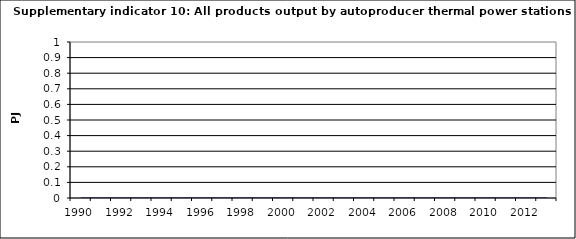
| Category | All products output by autoproducer thermal power stations, PJ |
|---|---|
| 1990 | 0 |
| 1991 | 0 |
| 1992 | 0 |
| 1993 | 0 |
| 1994 | 0 |
| 1995 | 0 |
| 1996 | 0 |
| 1997 | 0 |
| 1998 | 0 |
| 1999 | 0 |
| 2000 | 0 |
| 2001 | 0 |
| 2002 | 0 |
| 2003 | 0 |
| 2004 | 0 |
| 2005 | 0 |
| 2006 | 0 |
| 2007 | 0 |
| 2008 | 0 |
| 2009 | 0 |
| 2010 | 0 |
| 2011 | 0 |
| 2012 | 0 |
| 2013 | 0 |